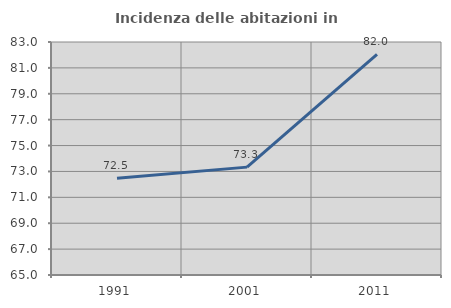
| Category | Incidenza delle abitazioni in proprietà  |
|---|---|
| 1991.0 | 72.474 |
| 2001.0 | 73.333 |
| 2011.0 | 82.044 |